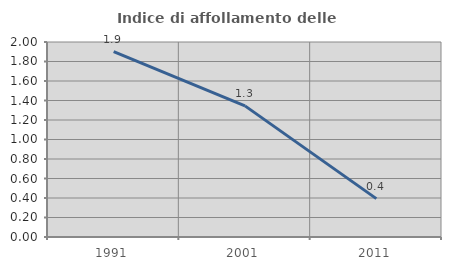
| Category | Indice di affollamento delle abitazioni  |
|---|---|
| 1991.0 | 1.901 |
| 2001.0 | 1.345 |
| 2011.0 | 0.394 |